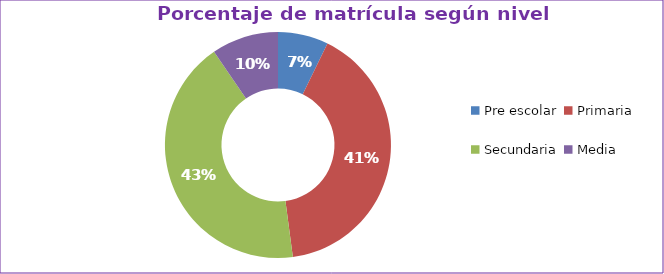
| Category | Series 0 |
|---|---|
| Pre escolar | 0.072 |
| Primaria | 0.407 |
| Secundaria | 0.425 |
| Media | 0.096 |